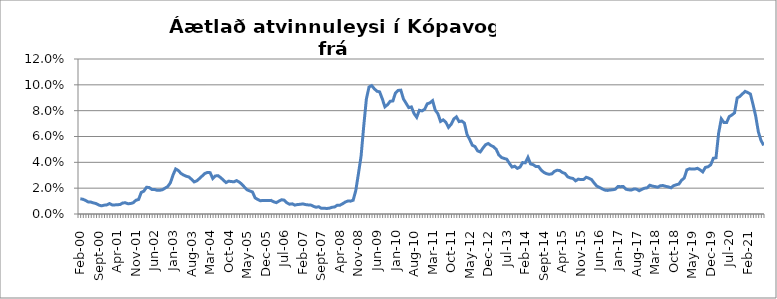
| Category | Series 0 |
|---|---|
| feb.00 | 0.012 |
| mar.00 | 0.011 |
| apr.00 | 0.01 |
| maí.00 | 0.009 |
| jún.00 | 0.009 |
| júl.00 | 0.009 |
| ágú.00 | 0.008 |
| sep.00 | 0.007 |
| okt.00 | 0.006 |
| nóv.00 | 0.007 |
| des.00 | 0.007 |
| jan.01 | 0.008 |
| feb.01 | 0.007 |
| mar.01 | 0.007 |
| apr.01 | 0.007 |
| maí.01 | 0.007 |
| jún.01 | 0.009 |
| júl.01 | 0.009 |
| ágú.01 | 0.008 |
| sep.01 | 0.008 |
| okt.01 | 0.009 |
| nóv.01 | 0.011 |
| des.01 | 0.011 |
| jan.02 | 0.017 |
| feb.02 | 0.018 |
| mar.02 | 0.021 |
| apr.02 | 0.02 |
| maí.02 | 0.019 |
| jún.02 | 0.019 |
| júl.02 | 0.018 |
| ágú.02 | 0.018 |
| sep.02 | 0.019 |
| okt.02 | 0.02 |
| nóv.02 | 0.021 |
| des.02 | 0.024 |
| jan.03 | 0.03 |
| feb.03 | 0.035 |
| mar.03 | 0.034 |
| apr.03 | 0.031 |
| maí.03 | 0.03 |
| jún.03 | 0.029 |
| júl.03 | 0.029 |
| ágú.03 | 0.027 |
| sep.03 | 0.025 |
| okt.03 | 0.026 |
| nóv.03 | 0.028 |
| des.03 | 0.029 |
| jan.04 | 0.031 |
| feb.04 | 0.032 |
| mar.04 | 0.032 |
| apr.04 | 0.027 |
| maí.04 | 0.029 |
| jún.04 | 0.03 |
| júl.04 | 0.028 |
| ágú.04 | 0.026 |
| sep.04 | 0.024 |
| okt.04 | 0.025 |
| nóv.04 | 0.025 |
| des.04 | 0.025 |
| jan.05 | 0.026 |
| feb.05 | 0.025 |
| mar.05 | 0.023 |
| apr.05 | 0.021 |
| maí.05 | 0.019 |
| jún.05 | 0.018 |
| júl.05 | 0.017 |
| ágú.05 | 0.012 |
| sep.05 | 0.011 |
| okt.05 | 0.01 |
| nóv.05 | 0.011 |
| des.05 | 0.01 |
| jan.06 | 0.01 |
| feb.06 | 0.011 |
| mar.06 | 0.009 |
| apr.06 | 0.009 |
| maí.06 | 0.01 |
| jún.06 | 0.011 |
| júl.06 | 0.011 |
| ágú.06 | 0.009 |
| sep.06 | 0.008 |
| okt.06 | 0.008 |
| nóv.06 | 0.007 |
| des.06 | 0.007 |
| jan.07 | 0.008 |
| feb.07 | 0.008 |
| mar.07 | 0.007 |
| apr.07 | 0.007 |
| maí.07 | 0.007 |
| jún.07 | 0.006 |
| júl.07 | 0.005 |
| ágú.07 | 0.006 |
| sep.07 | 0.004 |
| okt.07 | 0.004 |
| nóv.07 | 0.004 |
| des.07 | 0.004 |
| jan.08 | 0.005 |
| feb.08 | 0.005 |
| mar.08 | 0.007 |
| apr.08 | 0.007 |
| maí.08 | 0.008 |
| jún.08 | 0.009 |
| júl.08 | 0.01 |
| ágú.08 | 0.01 |
| sep.08 | 0.011 |
| okt.08 | 0.018 |
| nóv.08 | 0.031 |
| des.08 | 0.045 |
| jan.09 | 0.068 |
| feb.09 | 0.089 |
| mar.09 | 0.098 |
| apr.09 | 0.099 |
| maí.09 | 0.097 |
| jún.09 | 0.095 |
| júl.09 | 0.095 |
| ágú.09 | 0.089 |
| sep.09 | 0.083 |
| okt.09 | 0.085 |
| nóv.09 | 0.087 |
| des.09 | 0.088 |
| jan.10 | 0.094 |
| feb.10 | 0.096 |
| mar.10 | 0.096 |
| apr.10 | 0.089 |
| maí.10 | 0.086 |
| jún.10 | 0.082 |
| júl.10 | 0.083 |
| ágú.10 | 0.078 |
| sep.10 | 0.075 |
| okt.10 | 0.08 |
| nóv.10 | 0.08 |
| des.10 | 0.081 |
| jan.11 | 0.085 |
| feb.11 | 0.086 |
| mar.11 | 0.088 |
| apr.11 | 0.08 |
| maí.11 | 0.078 |
| jún.11 | 0.072 |
| júl.11 | 0.073 |
| ágú.11 | 0.071 |
| sep.11 | 0.067 |
| okt.11 | 0.069 |
| nóv.11 | 0.074 |
| des.11 | 0.075 |
| jan.12 | 0.072 |
| feb.12 | 0.072 |
| mar.12 | 0.07 |
| apr.12 | 0.062 |
| maí.12 | 0.058 |
| jún.12 | 0.053 |
| júl.12 | 0.052 |
| ágú.12 | 0.049 |
| sep.12 | 0.048 |
| okt.12 | 0.051 |
| nóv.12 | 0.054 |
| des.12 | 0.055 |
| jan.13 | 0.053 |
| feb.13 | 0.052 |
| mar.13 | 0.05 |
| apr.13 | 0.046 |
| maí.13 | 0.044 |
| jún.13 | 0.043 |
| júl.13 | 0.042 |
| ágú.13 | 0.039 |
| sep.13 | 0.036 |
| okt.13 | 0.037 |
| nóv.13 | 0.035 |
| des.13 | 0.036 |
| jan.14* | 0.04 |
| feb.14 | 0.04 |
| mar.14 | 0.044 |
| apr.14 | 0.039 |
| maí.14 | 0.038 |
| jún.14 | 0.037 |
| júl.14 | 0.037 |
| ágú.14 | 0.034 |
| sep.14 | 0.032 |
| okt.14*** | 0.031 |
| nóv.14*** | 0.031 |
| des.14 | 0.031 |
| jan.15 | 0.033 |
| feb.15 | 0.034 |
| mar.15 | 0.034 |
| apr.15 | 0.032 |
| maí.15 | 0.031 |
| jún.15 | 0.029 |
| júl.15 | 0.028 |
| ágú.15 | 0.028 |
| sep.15 | 0.026 |
| okt.15 | 0.027 |
| nóv.15 | 0.027 |
| des.15 | 0.027 |
| jan.16 | 0.028 |
| feb.16 | 0.028 |
| mar.16 | 0.027 |
| apr.16 | 0.024 |
| maí.16 | 0.022 |
| jún.16 | 0.021 |
| júl.16 | 0.019 |
| ágú.16 | 0.019 |
| sep.16 | 0.018 |
| okt.16 | 0.019 |
| nóv.16 | 0.019 |
| des.16 | 0.019 |
| jan.17 | 0.021 |
| feb.17 | 0.021 |
| mar.17 | 0.021 |
| apr.17 | 0.019 |
| maí.17 | 0.019 |
| jún.17 | 0.019 |
| júl.17 | 0.019 |
| ágú.17 | 0.019 |
| sep.17 | 0.018 |
| okt.17 | 0.019 |
| nóv.17 | 0.02 |
| des.17 | 0.02 |
| jan.18 | 0.022 |
| feb.18 | 0.022 |
| mar.18 | 0.021 |
| apr.18 | 0.021 |
| maí.18 | 0.022 |
| jún.18 | 0.022 |
| júl.18 | 0.021 |
| ágú.18 | 0.021 |
| sep.18 | 0.02 |
| okt.18 | 0.022 |
| nóv.18 | 0.023 |
| des.18 | 0.023 |
| jan.19 | 0.026 |
| feb.19 | 0.028 |
| mar.19 | 0.034 |
| apr.19 | 0.035 |
| maí.19 | 0.035 |
| jún.19 | 0.035 |
| júl.19 | 0.035 |
| ágú.19 | 0.034 |
| sep.19 | 0.033 |
| okt.19 | 0.036 |
| nóv.19 | 0.037 |
| des.19 | 0.038 |
| jan.20 | 0.043 |
| feb.20 | 0.044 |
| mars 2020* | 0.063 |
| apr.20 | 0.074 |
| maí.20 | 0.071 |
| jún.20 | 0.071 |
| júl.20 | 0.075 |
| ágú.20 | 0.077 |
| sep.20 | 0.078 |
| okt.20 | 0.09 |
| nóv.20 | 0.091 |
| des.20 | 0.093 |
| jan.21 | 0.095 |
| feb.21 | 0.094 |
| mar.21 | 0.093 |
| apr.21 | 0.085 |
| maí.21 | 0.076 |
| jún.21 | 0.064 |
| júl.21 | 0.057 |
| ágú.21 | 0.053 |